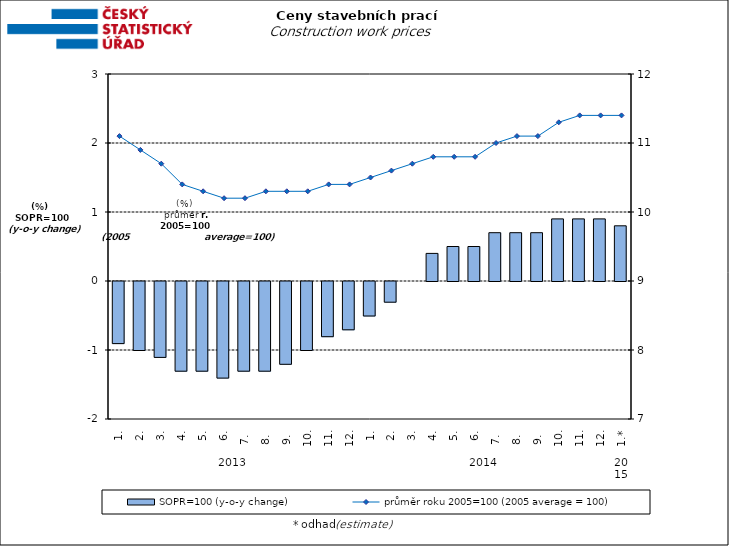
| Category | SOPR=100 (y-o-y change)   |
|---|---|
| 0 | -0.9 |
| 1 | -1 |
| 2 | -1.1 |
| 3 | -1.3 |
| 4 | -1.3 |
| 5 | -1.4 |
| 6 | -1.3 |
| 7 | -1.3 |
| 8 | -1.2 |
| 9 | -1 |
| 10 | -0.8 |
| 11 | -0.7 |
| 12 | -0.5 |
| 13 | -0.3 |
| 14 | 0 |
| 15 | 0.4 |
| 16 | 0.5 |
| 17 | 0.5 |
| 18 | 0.7 |
| 19 | 0.7 |
| 20 | 0.7 |
| 21 | 0.9 |
| 22 | 0.9 |
| 23 | 0.9 |
| 24 | 0.8 |